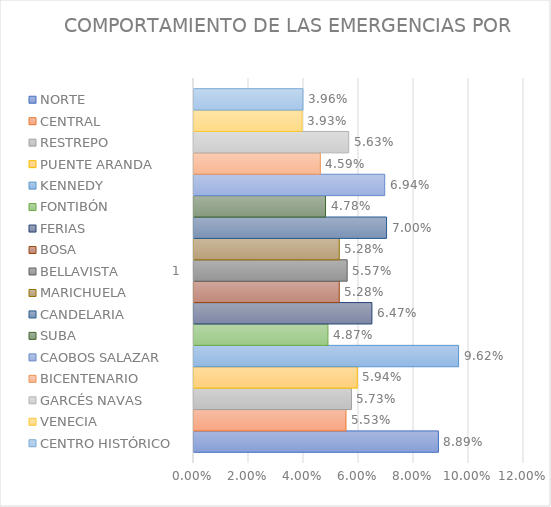
| Category | NORTE | CENTRAL | RESTREPO | PUENTE ARANDA | KENNEDY | FONTIBÓN | FERIAS | BOSA | BELLAVISTA | MARICHUELA | CANDELARIA | SUBA | CAOBOS SALAZAR | BICENTENARIO | GARCÉS NAVAS | VENECIA | CENTRO HISTÓRICO |
|---|---|---|---|---|---|---|---|---|---|---|---|---|---|---|---|---|---|
| 0 | 0.089 | 0.055 | 0.057 | 0.059 | 0.096 | 0.049 | 0.065 | 0.053 | 0.056 | 0.053 | 0.07 | 0.048 | 0.069 | 0.046 | 0.056 | 0.039 | 0.04 |